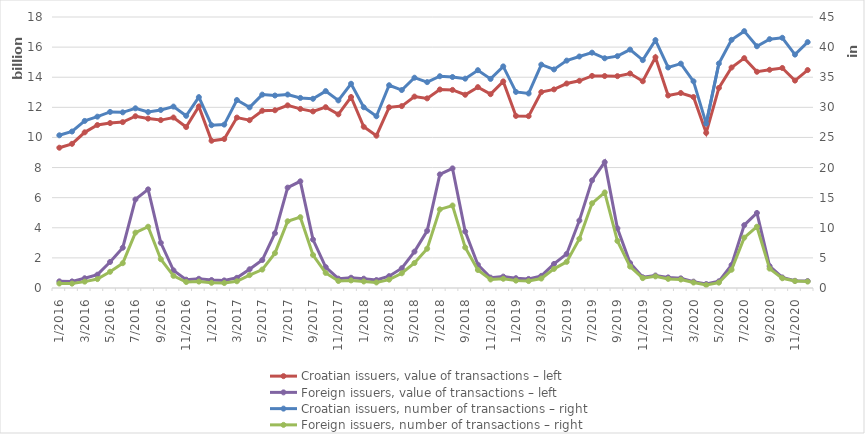
| Category | Croatian issuers, value of transactions – left | Foreign issuers, value of transactions – left |
|---|---|---|
| 1/2016 | 9317746815 | 441856028 |
| 2/2016 | 9576821038 | 438769379 |
| 3/2016 | 10339326725 | 647339028 |
| 4/2016 | 10825809318 | 884583155 |
| 5/2016 | 10955398175 | 1729494397 |
| 6/2016 | 11018977541 | 2676151777 |
| 7/2016 | 11407397299 | 5882317756 |
| 8/2016 | 11252543958 | 6552115285 |
| 9/2016 | 11152267687 | 3000126625 |
| 10/2016 | 11323295107 | 1172353982 |
| 11/2016 | 10690015167 | 552867564 |
| 12/2016 | 12058984612 | 610678340 |
| 1/2017 | 9781216393 | 529330668 |
| 2/2017 | 9895011020 | 503480826 |
| 3/2017 | 11319301571 | 675467602 |
| 4/2017 | 11145176506 | 1243470970 |
| 5/2017 | 11773923776 | 1858098682 |
| 6/2017 | 11805960086 | 3640275087 |
| 7/2017 | 12131026231 | 6666766323 |
| 8/2017 | 11896320391 | 7086538105 |
| 9/2017 | 11728853022 | 3215744763 |
| 10/2017 | 12009171220 | 1390350453 |
| 11/2017 | 11534666862 | 620958222 |
| 12/2017 | 12684067350 | 681553609 |
| 1/2018 | 10709711514 | 618243765 |
| 2/2018 | 10117059082 | 528007961 |
| 3/2018 | 12000973469 | 787148459 |
| 4/2018 | 12081590304 | 1313997401 |
| 5/2018 | 12713805892 | 2414981001 |
| 6/2018 | 12594666713 | 3797479716 |
| 7/2018 | 13185004027 | 7546528379 |
| 8/2018 | 13157775731 | 7945964838 |
| 9/2018 | 12836023765 | 3750047605 |
| 10/2018 | 13341712666 | 1546133091 |
| 11/2018 | 12874154228 | 688682409 |
| 12/2018 | 13720353038 | 756236735 |
| 1/2019 | 11430961856 | 651874544 |
| 2/2019 | 11414718977 | 601782396 |
| 3/2019 | 13014399161 | 805219170 |
| 4/2019 | 13191260421 | 1598408777 |
| 5/2019 | 13580364900 | 2261956817 |
| 6/2019 | 13761363081 | 4476990759 |
| 7/2019 | 14088269414 | 7149142603 |
| 8/2019 | 14078608908 | 8359730082 |
| 9/2019 | 14072427523 | 3961960473 |
| 10/2019 | 14247219239 | 1659254244 |
| 11/2019 | 13732018595 | 710916631 |
| 12/2019 | 15325515357 | 828086145 |
| 1/2020 | 12787968816 | 701885312 |
| 2/2020 | 12952745874 | 640393636 |
| 3/2020 | 12683902324 | 422510481 |
| 4/2020 | 10305407524 | 264509749 |
| 5/2020 | 13287223415 | 444303649 |
| 6/2020 | 14645164496 | 1525289649 |
| 7/2020 | 15267977450 | 4173388524 |
| 8/2020 | 14362397361 | 4985377427 |
| 9/2020 | 14494659494 | 1454718337 |
| 10/2020 | 14614059699 | 700485949 |
| 11/2020 | 13777009716 | 477615413 |
| 12/2020 | 14475413547 | 459983904 |